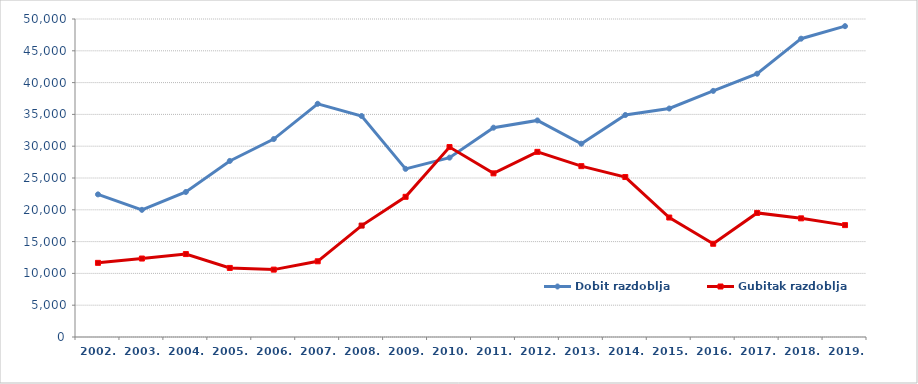
| Category | Dobit razdoblja | Gubitak razdoblja |
|---|---|---|
| 2002. | 22423 | 11658 |
| 2003. | 19994 | 12336 |
| 2004. | 22801 | 13039 |
| 2005. | 27683 | 10861 |
| 2006. | 31121 | 10595 |
| 2007. | 36668 | 11904 |
| 2008. | 34746 | 17517 |
| 2009. | 26438 | 22041 |
| 2010. | 28203 | 29866 |
| 2011. | 32911 | 25731 |
| 2012. | 34053 | 29112 |
| 2013. | 30392 | 26862 |
| 2014. | 34904 | 25150 |
| 2015. | 35925.884 | 18786.38 |
| 2016. | 38695.898 | 14660.642 |
| 2017. | 41397 | 19512 |
| 2018. | 46905 | 18655 |
| 2019. | 48872.344 | 17591.012 |